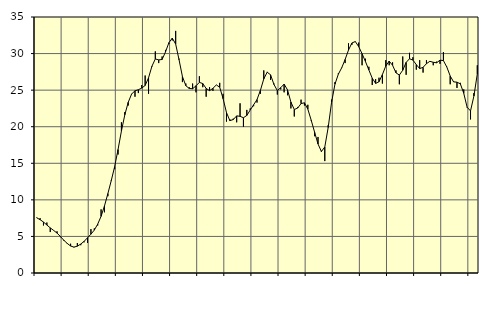
| Category | Piggar | Series 1 |
|---|---|---|
| nan | 7.6 | 7.55 |
| 87.0 | 7.5 | 7.29 |
| 87.0 | 6.5 | 6.97 |
| 87.0 | 6.9 | 6.56 |
| nan | 5.6 | 6.17 |
| 88.0 | 5.8 | 5.82 |
| 88.0 | 5.7 | 5.46 |
| 88.0 | 4.9 | 4.99 |
| nan | 4.4 | 4.48 |
| 89.0 | 4 | 4.05 |
| 89.0 | 4 | 3.69 |
| 89.0 | 3.5 | 3.54 |
| nan | 4.1 | 3.67 |
| 90.0 | 3.8 | 3.96 |
| 90.0 | 4.2 | 4.33 |
| 90.0 | 4.1 | 4.82 |
| nan | 6 | 5.31 |
| 91.0 | 6.1 | 5.87 |
| 91.0 | 6.5 | 6.68 |
| 91.0 | 8.7 | 7.75 |
| nan | 8.3 | 9.17 |
| 92.0 | 10.5 | 10.85 |
| 92.0 | 12.7 | 12.63 |
| 92.0 | 14.2 | 14.54 |
| nan | 16.2 | 16.88 |
| 93.0 | 20.6 | 19.41 |
| 93.0 | 22 | 21.63 |
| 93.0 | 22.9 | 23.33 |
| nan | 24.5 | 24.47 |
| 94.0 | 24.1 | 24.91 |
| 94.0 | 24.6 | 25.06 |
| 94.0 | 25.7 | 25.28 |
| nan | 27 | 25.64 |
| 95.0 | 24.5 | 26.69 |
| 95.0 | 28.2 | 28.27 |
| 95.0 | 30.3 | 29.26 |
| nan | 28.7 | 29.14 |
| 96.0 | 29.6 | 29.19 |
| 96.0 | 30.5 | 30.22 |
| 96.0 | 31.3 | 31.48 |
| nan | 31.8 | 32.11 |
| 97.0 | 33.1 | 31.3 |
| 97.0 | 29.3 | 29.16 |
| 97.0 | 26.1 | 26.86 |
| nan | 25.9 | 25.61 |
| 98.0 | 25.4 | 25.23 |
| 98.0 | 25.9 | 25.19 |
| 98.0 | 24.7 | 25.59 |
| nan | 26.9 | 26.06 |
| 99.0 | 25.4 | 25.9 |
| 99.0 | 24.1 | 25.23 |
| 99.0 | 25.4 | 24.93 |
| nan | 24.9 | 25.25 |
| 0.0 | 25.7 | 25.71 |
| 0.0 | 26 | 25.4 |
| 0.0 | 24.5 | 23.83 |
| nan | 20.7 | 21.93 |
| 1.0 | 21 | 20.83 |
| 1.0 | 21.1 | 20.98 |
| 1.0 | 20.6 | 21.48 |
| nan | 23.2 | 21.42 |
| 2.0 | 20 | 21.23 |
| 2.0 | 22.3 | 21.54 |
| 2.0 | 22.5 | 22.28 |
| nan | 22.8 | 23 |
| 3.0 | 23.3 | 23.71 |
| 3.0 | 24.5 | 24.96 |
| 3.0 | 27.7 | 26.53 |
| nan | 27.5 | 27.45 |
| 4.0 | 26.4 | 27.1 |
| 4.0 | 25.9 | 25.78 |
| 4.0 | 24.4 | 24.94 |
| nan | 25.1 | 25.34 |
| 5.0 | 24.7 | 25.82 |
| 5.0 | 24.3 | 25.04 |
| 5.0 | 22.5 | 23.37 |
| nan | 21.4 | 22.35 |
| 6.0 | 22.7 | 22.55 |
| 6.0 | 23.7 | 23.16 |
| 6.0 | 22.9 | 23.27 |
| nan | 23 | 22.4 |
| 7.0 | 20.8 | 20.88 |
| 7.0 | 18.7 | 19.24 |
| 7.0 | 18.6 | 17.64 |
| nan | 16.7 | 16.61 |
| 8.0 | 15.3 | 17.23 |
| 8.0 | 20.2 | 19.89 |
| 8.0 | 23.7 | 23.33 |
| nan | 26.1 | 25.82 |
| 9.0 | 27.3 | 27.18 |
| 9.0 | 28.1 | 28.06 |
| 9.0 | 28.7 | 29.19 |
| nan | 31.4 | 30.48 |
| 10.0 | 31.2 | 31.45 |
| 10.0 | 31.6 | 31.64 |
| 10.0 | 31.5 | 30.96 |
| nan | 28.4 | 29.98 |
| 11.0 | 29.3 | 28.91 |
| 11.0 | 28.2 | 27.76 |
| 11.0 | 25.7 | 26.63 |
| nan | 26.5 | 25.92 |
| 12.0 | 26.7 | 26.15 |
| 12.0 | 25.9 | 27.13 |
| 12.0 | 29.1 | 28.3 |
| nan | 28.4 | 28.97 |
| 13.0 | 28.8 | 28.4 |
| 13.0 | 27.7 | 27.37 |
| 13.0 | 25.8 | 27.06 |
| nan | 29.6 | 27.72 |
| 14.0 | 27.1 | 28.79 |
| 14.0 | 30.1 | 29.29 |
| 14.0 | 29.5 | 29.11 |
| nan | 27.8 | 28.49 |
| 15.0 | 29.1 | 27.95 |
| 15.0 | 27.4 | 28.12 |
| 15.0 | 29.1 | 28.62 |
| nan | 28.9 | 28.94 |
| 16.0 | 28.4 | 28.81 |
| 16.0 | 28.9 | 28.74 |
| 16.0 | 28.6 | 29.1 |
| nan | 30.2 | 29.04 |
| 17.0 | 28.2 | 28.16 |
| 17.0 | 25.8 | 26.94 |
| 17.0 | 26.2 | 26.13 |
| nan | 25.3 | 26.09 |
| 18.0 | 26 | 25.86 |
| 18.0 | 25.1 | 24.57 |
| 18.0 | 22.6 | 22.66 |
| nan | 21 | 22.16 |
| 19.0 | 24.6 | 24.2 |
| 19.0 | 28.4 | 27.21 |